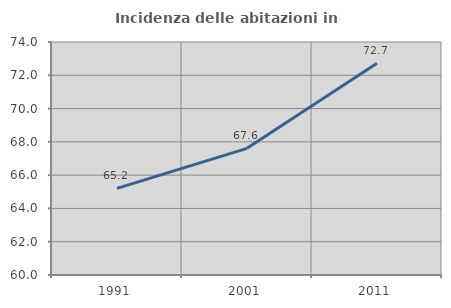
| Category | Incidenza delle abitazioni in proprietà  |
|---|---|
| 1991.0 | 65.207 |
| 2001.0 | 67.611 |
| 2011.0 | 72.727 |